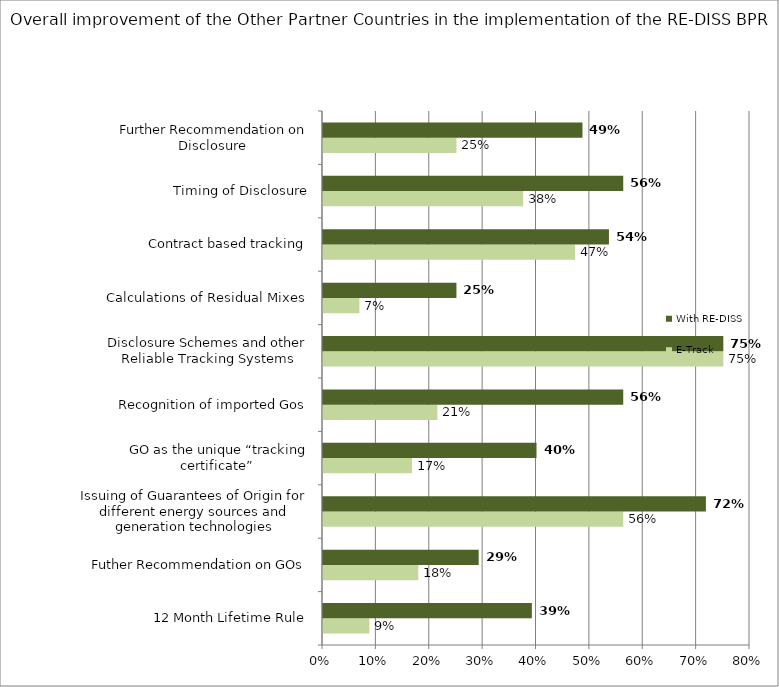
| Category | E-Track | With RE-DISS |
|---|---|---|
| 12 Month Lifetime Rule | 0.087 | 0.391 |
| Futher Recommendation on GOs | 0.179 | 0.292 |
| Issuing of Guarantees of Origin for different energy sources and generation technologies | 0.562 | 0.717 |
| GO as the unique “tracking certificate”  | 0.167 | 0.4 |
| Recognition of imported Gos | 0.214 | 0.562 |
| Disclosure Schemes and other Reliable Tracking Systems | 0.75 | 0.75 |
| Calculations of Residual Mixes | 0.068 | 0.25 |
| Contract based tracking | 0.472 | 0.536 |
| Timing of Disclosure | 0.375 | 0.562 |
| Further Recommendation on Disclosure  | 0.25 | 0.486 |